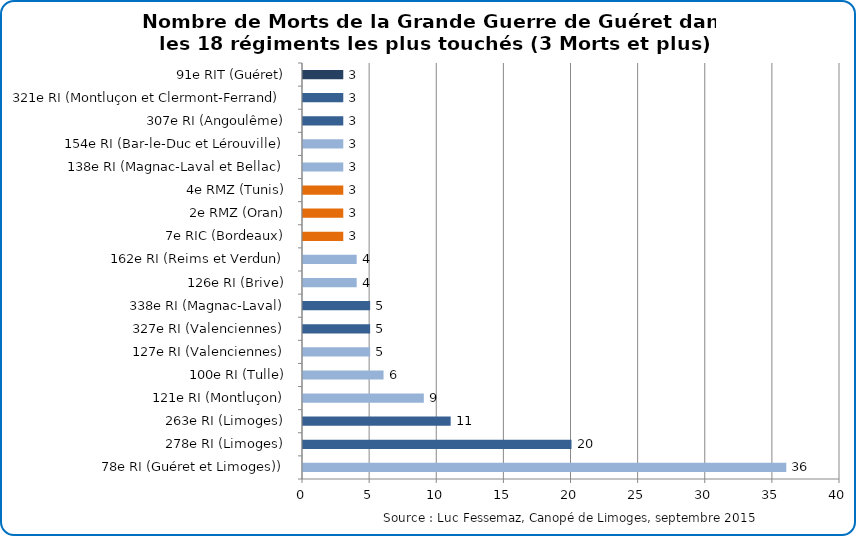
| Category | Nombre de Morts de la Grande Guerre de Guéret dans les 18 régiments les plus touchés |
|---|---|
| 78e RI (Guéret et Limoges)) | 36 |
| 278e RI (Limoges) | 20 |
| 263e RI (Limoges) | 11 |
| 121e RI (Montluçon) | 9 |
| 100e RI (Tulle) | 6 |
| 127e RI (Valenciennes) | 5 |
| 327e RI (Valenciennes) | 5 |
| 338e RI (Magnac-Laval) | 5 |
| 126e RI (Brive) | 4 |
| 162e RI (Reims et Verdun) | 4 |
| 7e RIC (Bordeaux) | 3 |
| 2e RMZ (Oran) | 3 |
| 4e RMZ (Tunis) | 3 |
| 138e RI (Magnac-Laval et Bellac) | 3 |
| 154e RI (Bar-le-Duc et Lérouville) | 3 |
| 307e RI (Angoulême) | 3 |
| 321e RI (Montluçon et Clermont-Ferrand) | 3 |
| 91e RIT (Guéret) | 3 |